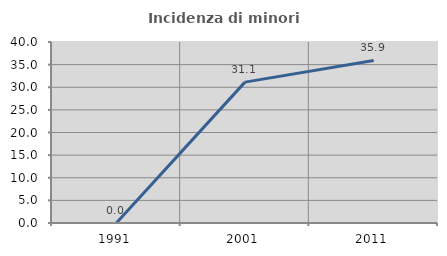
| Category | Incidenza di minori stranieri |
|---|---|
| 1991.0 | 0 |
| 2001.0 | 31.132 |
| 2011.0 | 35.922 |